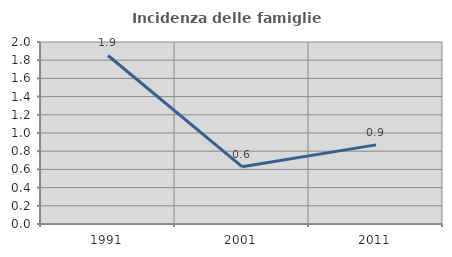
| Category | Incidenza delle famiglie numerose |
|---|---|
| 1991.0 | 1.852 |
| 2001.0 | 0.63 |
| 2011.0 | 0.87 |